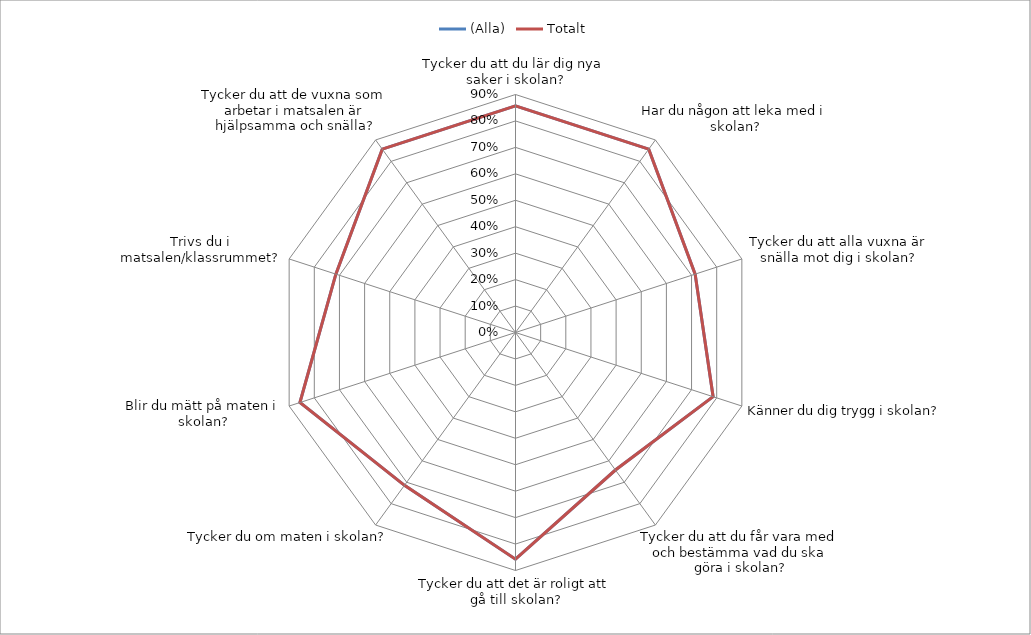
| Category | (Alla) | Totalt |
|---|---|---|
| Tycker du att du lär dig nya saker i skolan? | 0.857 | 0.857 |
| Har du någon att leka med i skolan? | 0.857 | 0.857 |
| Tycker du att alla vuxna är snälla mot dig i skolan? | 0.714 | 0.714 |
| Känner du dig trygg i skolan? | 0.786 | 0.786 |
| Tycker du att du får vara med och bestämma vad du ska göra i skolan? | 0.643 | 0.643 |
| Tycker du att det är roligt att gå till skolan? | 0.857 | 0.857 |
| Tycker du om maten i skolan? | 0.714 | 0.714 |
| Blir du mätt på maten i skolan? | 0.857 | 0.857 |
| Trivs du i matsalen/klassrummet? | 0.714 | 0.714 |
| Tycker du att de vuxna som arbetar i matsalen är hjälpsamma och snälla? | 0.857 | 0.857 |